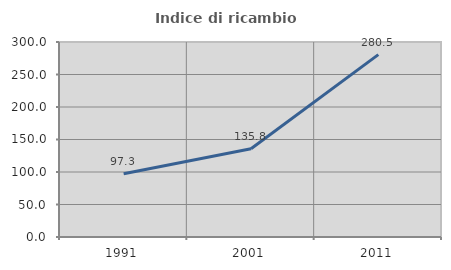
| Category | Indice di ricambio occupazionale  |
|---|---|
| 1991.0 | 97.267 |
| 2001.0 | 135.781 |
| 2011.0 | 280.525 |